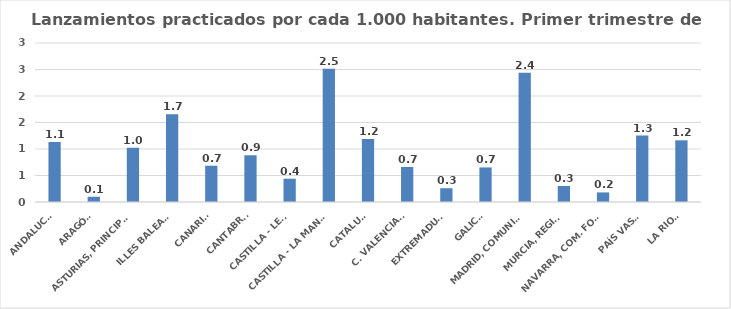
| Category | 616 |
|---|---|
| ANDALUCÍA | 1.132 |
| ARAGÓN | 0.099 |
| ASTURIAS, PRINCIPADO | 1.024 |
| ILLES BALEARS | 1.658 |
| CANARIAS | 0.685 |
| CANTABRIA | 0.882 |
| CASTILLA - LEÓN | 0.439 |
| CASTILLA - LA MANCHA | 2.514 |
| CATALUÑA | 1.188 |
| C. VALENCIANA | 0.661 |
| EXTREMADURA | 0.26 |
| GALICIA | 0.652 |
| MADRID, COMUNIDAD | 2.438 |
| MURCIA, REGIÓN | 0.303 |
| NAVARRA, COM. FORAL | 0.181 |
| PAÍS VASCO | 1.253 |
| LA RIOJA | 1.164 |